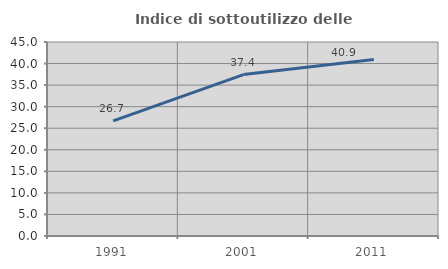
| Category | Indice di sottoutilizzo delle abitazioni  |
|---|---|
| 1991.0 | 26.718 |
| 2001.0 | 37.443 |
| 2011.0 | 40.927 |